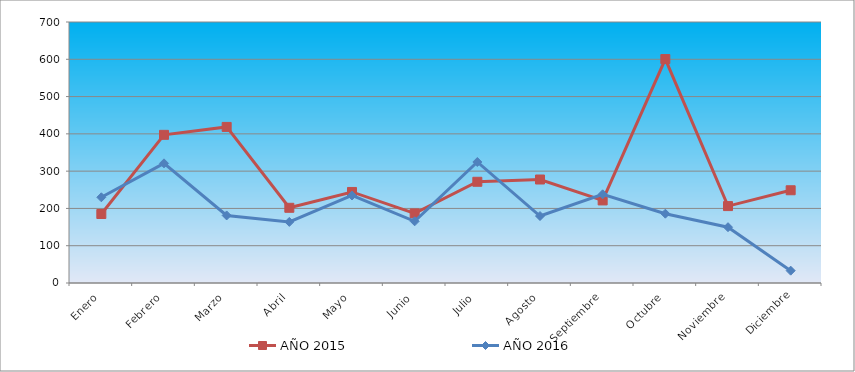
| Category | AÑO 2015 | AÑO 2016 |
|---|---|---|
| Enero | 185.035 | 229.875 |
| Febrero | 397.369 | 320.929 |
| Marzo | 418.603 | 181.183 |
| Abril | 201.718 | 163.852 |
| Mayo | 244.185 | 234.75 |
| Junio | 186.551 | 165.428 |
| Julio | 271.485 | 324.553 |
| Agosto | 277.552 | 179.607 |
| Septiembre | 221.435 | 237.901 |
| Octubre | 600.604 | 185.909 |
| Noviembre | 206.268 | 149.673 |
| Diciembre | 248.735 | 33.086 |